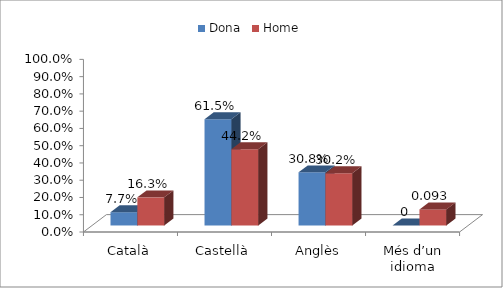
| Category | Dona | Home |
|---|---|---|
| Català | 0.077 | 0.163 |
| Castellà | 0.615 | 0.442 |
| Anglès | 0.308 | 0.302 |
| Més d’un idioma | 0 | 0.093 |